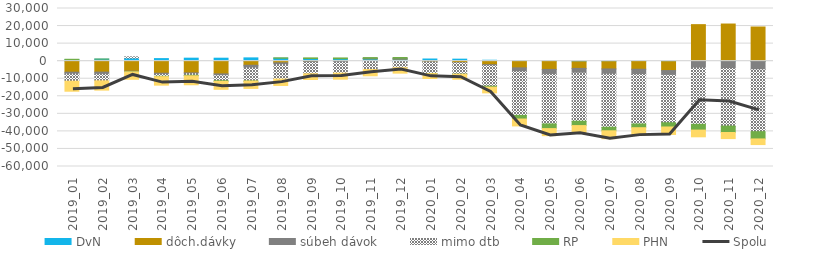
| Category | DvN | dôch.dávky | súbeh dávok | mimo dtb | RP | PHN |
|---|---|---|---|---|---|---|
| 2019_01 | 870 | -6279 | -1095 | -4049 | 208 | -5698 |
| 2019_02 | 1181 | -6228 | -1284 | -3701 | 27 | -5276 |
| 2019_03 | 1814 | -5714 | -300 | 658 | -97 | -4206 |
| 2019_04 | 1463 | -6845 | -695 | -1061 | -218 | -4847 |
| 2019_05 | 1706 | -6672 | -494 | -874 | -312 | -5089 |
| 2019_06 | 1690 | -7255 | -1026 | -2854 | -360 | -4539 |
| 2019_07 | 1872 | -2320 | -1544 | -7393 | -98 | -4172 |
| 2019_08 | 1677 | -960 | -1019 | -8212 | 225 | -3651 |
| 2019_09 | 1492 | -244 | -503 | -6451 | 380 | -3262 |
| 2019_10 | 1373 | -141 | -469 | -6213 | 462 | -3430 |
| 2019_11 | 1360 | 94 | 228 | -4771 | 357 | -3555 |
| 2019_12 | 1208 | 63 | 436 | -3754 | 390 | -3064 |
| 2020_01 | 1233 | -401 | -127 | -6472 | -86 | -2805 |
| 2020_02 | 1143 | -873 | -165 | -6387 | -28 | -2833 |
| 2020_03 | 518 | -2002 | -573 | -11703 | -527 | -3257 |
| 2020_04 | 208 | -3808 | -2190 | -24892 | -2071 | -3919 |
| 2020_05 | 74 | -4687 | -2867 | -28199 | -2659 | -4011 |
| 2020_06 | -316 | -3802 | -2746 | -27336 | -2491 | -4437 |
| 2020_07 | -249 | -4183 | -3017 | -30180 | -2038 | -4492 |
| 2020_08 | -159 | -4435 | -3031 | -28150 | -2126 | -4226 |
| 2020_09 | -244 | -5109 | -2722 | -27017 | -2397 | -4246 |
| 2020_10 | 0 | 20805 | -3935 | -32034 | -3291 | -3826 |
| 2020_11 | 437 | 20721 | -4173 | -32814 | -3652 | -3461 |
| 2020_12 | -94 | 19454 | -4802 | -35255 | -4148 | -3206 |